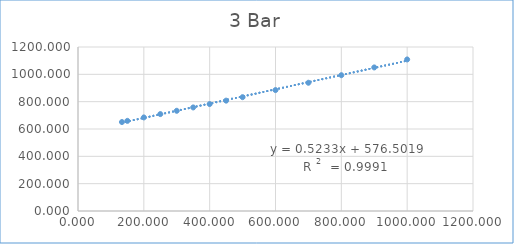
| Category | Series 0 |
|---|---|
| 133.5 | 650.956 |
| 150.0 | 659.627 |
| 200.0 | 684.639 |
| 250.0 | 709.006 |
| 300.0 | 733.301 |
| 350.0 | 757.764 |
| 400.0 | 782.489 |
| 450.0 | 807.525 |
| 500.0 | 832.919 |
| 600.0 | 884.854 |
| 700.0 | 938.414 |
| 800.0 | 993.622 |
| 900.0 | 1050.478 |
| 1000.0 | 1108.935 |